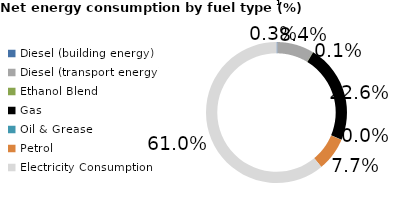
| Category | Net energy consumption by fuel type (%) |
|---|---|
| Diesel (building energy) | 0.003 |
| Diesel (transport energy) | 0.084 |
| Ethanol Blend | 0.001 |
| Gas | 0.226 |
| Oil & Grease | 0 |
| Petrol | 0.077 |
| Electricity Consumption | 0.61 |